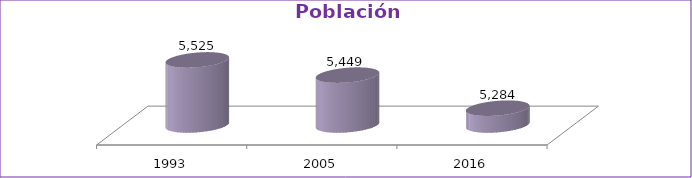
| Category | Población Total |
|---|---|
| 1993 | 5525 |
| 2005 | 5449 |
| 2016 | 5284 |